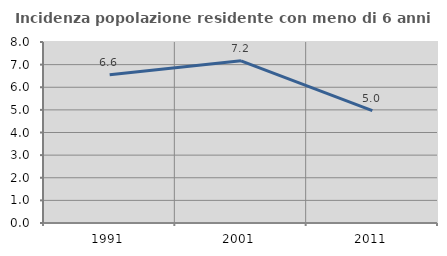
| Category | Incidenza popolazione residente con meno di 6 anni |
|---|---|
| 1991.0 | 6.555 |
| 2001.0 | 7.167 |
| 2011.0 | 4.968 |